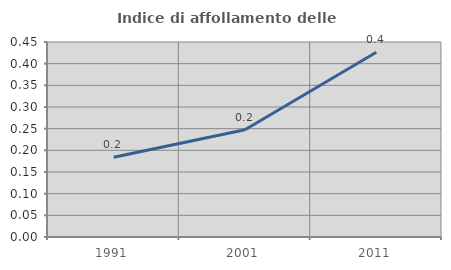
| Category | Indice di affollamento delle abitazioni  |
|---|---|
| 1991.0 | 0.184 |
| 2001.0 | 0.248 |
| 2011.0 | 0.426 |